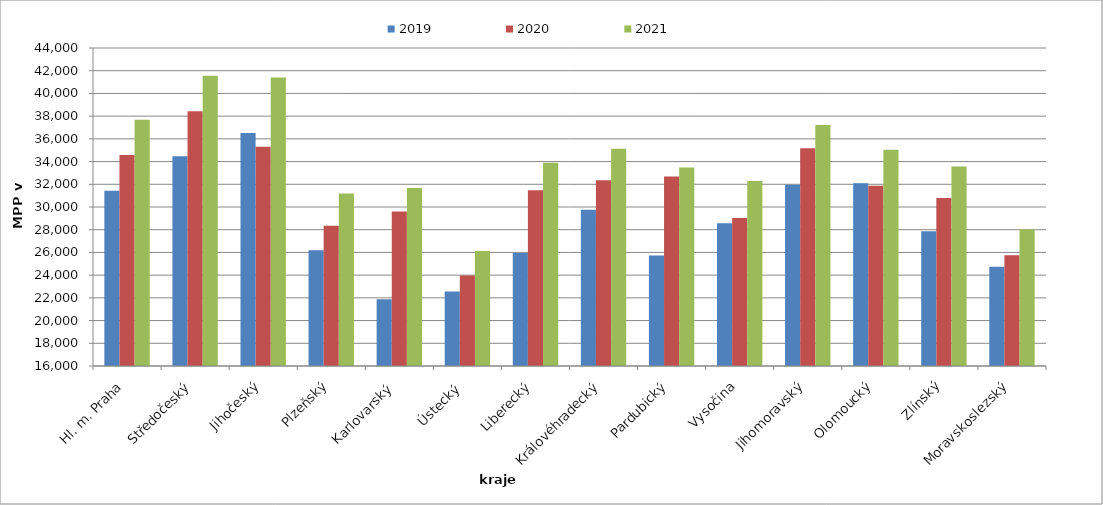
| Category | 2019 | 2020 | 2021 |
|---|---|---|---|
| Hl. m. Praha | 31438.927 | 34579.311 | 37693.379 |
| Středočeský | 34468.8 | 38430.72 | 41556.19 |
| Jihočeský | 36520.672 | 35296.293 | 41395.856 |
| Plzeňský | 26185.958 | 28347.628 | 31182.543 |
| Karlovarský  | 21866.667 | 29600 | 31680 |
| Ústecký   | 22548.82 | 23977.914 | 26135.706 |
| Liberecký | 25947.719 | 31466.21 | 33892.187 |
| Královéhradecký | 29748.46 | 32364.654 | 35137.447 |
| Pardubický | 25740.36 | 32680.377 | 33467.275 |
| Vysočina | 28580.007 | 29029.872 | 32288.263 |
| Jihomoravský | 31963.636 | 35167.712 | 37220.69 |
| Olomoucký | 32081.789 | 31861.383 | 35047.262 |
| Zlínský | 27857.832 | 30785.101 | 33570.006 |
| Moravskoslezský | 24747.731 | 25740.69 | 28050.752 |